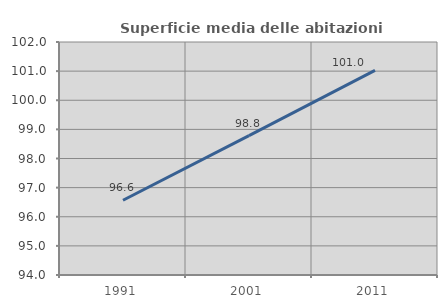
| Category | Superficie media delle abitazioni occupate |
|---|---|
| 1991.0 | 96.567 |
| 2001.0 | 98.783 |
| 2011.0 | 101.023 |